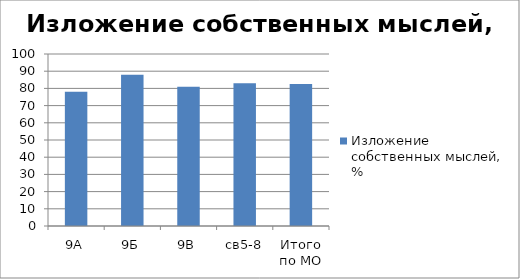
| Category | Изложение собственных мыслей, % |
|---|---|
| 9А | 78 |
| 9Б | 88 |
| 9В | 81 |
| св5-8 | 83 |
| Итого по МО | 82.5 |